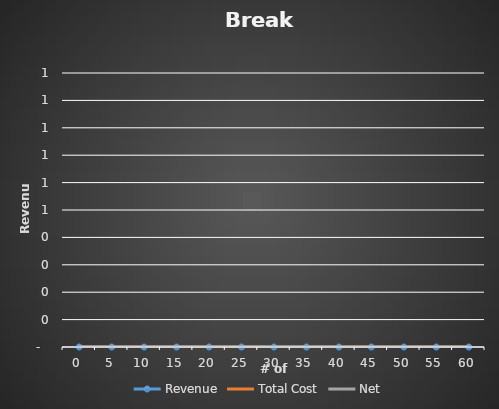
| Category | Revenue | Total Cost | Net |
|---|---|---|---|
| 0.0 | 0 | 0 | 0 |
| 5.0 | 0 | 0 | 0 |
| 10.0 | 0 | 0 | 0 |
| 15.0 | 0 | 0 | 0 |
| 20.0 | 0 | 0 | 0 |
| 25.0 | 0 | 0 | 0 |
| 30.0 | 0 | 0 | 0 |
| 35.0 | 0 | 0 | 0 |
| 40.0 | 0 | 0 | 0 |
| 45.0 | 0 | 0 | 0 |
| 50.0 | 0 | 0 | 0 |
| 55.0 | 0 | 0 | 0 |
| 60.0 | 0 | 0 | 0 |